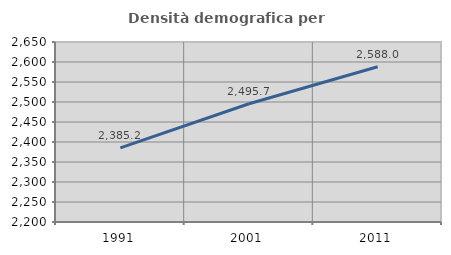
| Category | Densità demografica |
|---|---|
| 1991.0 | 2385.157 |
| 2001.0 | 2495.713 |
| 2011.0 | 2588.025 |